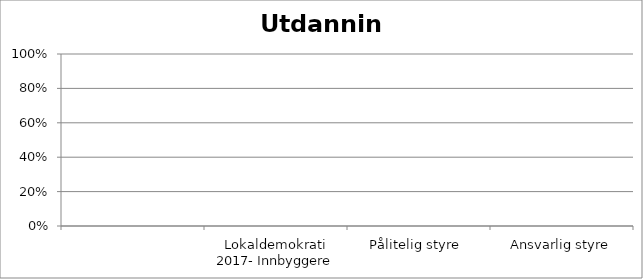
| Category | Series 0 |
|---|---|
|  | 0 |
| Lokaldemokrati 2017- Innbyggere | 0 |
| Pålitelig styre  | 0 |
| Ansvarlig styre | 0 |